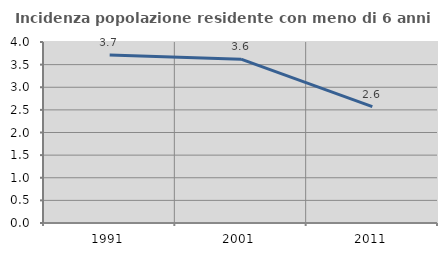
| Category | Incidenza popolazione residente con meno di 6 anni |
|---|---|
| 1991.0 | 3.714 |
| 2001.0 | 3.62 |
| 2011.0 | 2.571 |